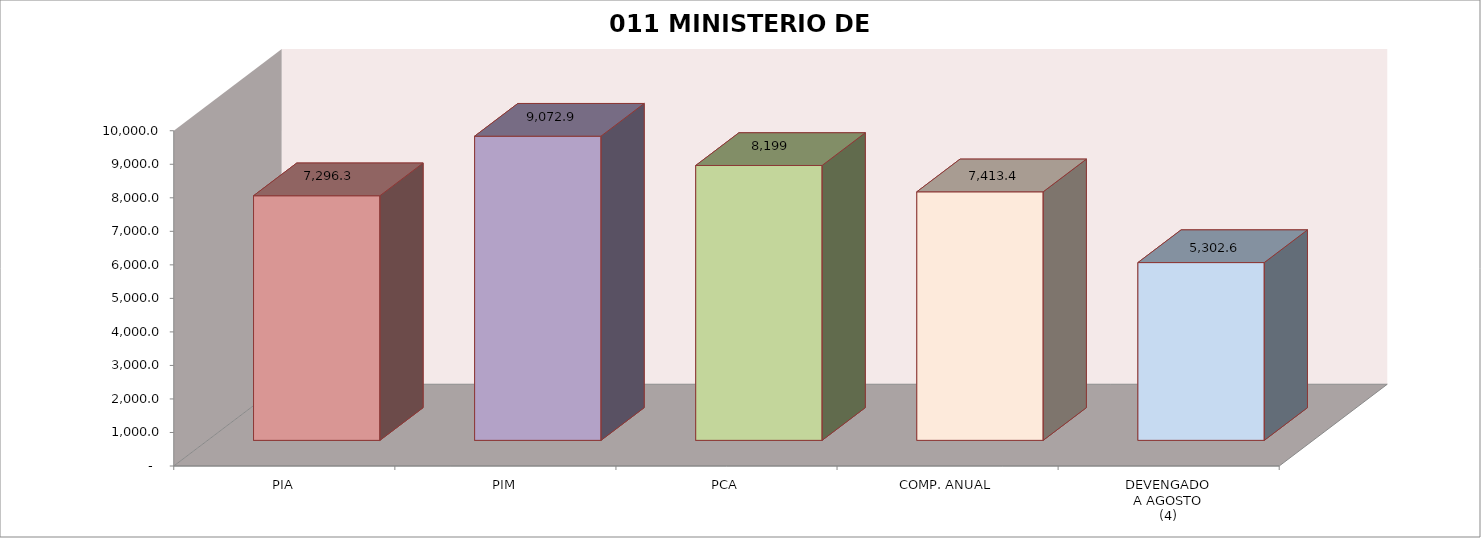
| Category | 011 MINISTERIO DE SALUD |
|---|---|
| PIA | 7296.309 |
| PIM | 9072.87 |
| PCA | 8199.034 |
| COMP. ANUAL | 7413.405 |
| DEVENGADO
A AGOSTO
(4) | 5302.607 |